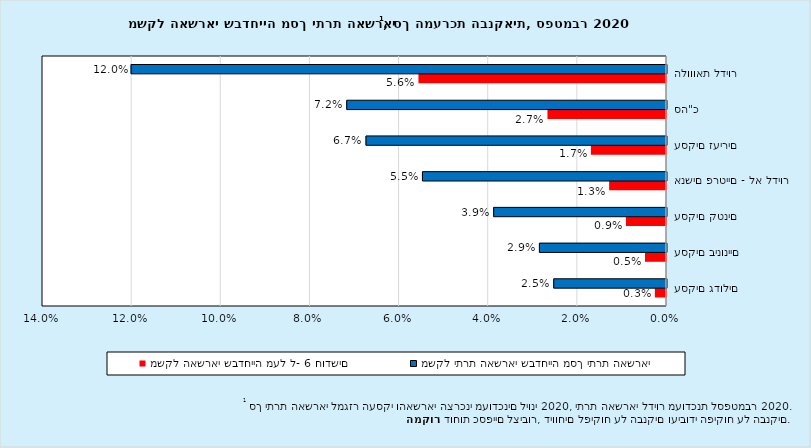
| Category | משקל האשראי שבדחייה מעל ל- 6 חודשים | משקל יתרת האשראי שבדחייה מסך יתרת האשראי |
|---|---|---|
| עסקים גדולים | 0.003 | 0.025 |
| עסקים בינוניים | 0.005 | 0.029 |
| עסקים קטנים | 0.009 | 0.039 |
| אנשים פרטיים - לא לדיור | 0.013 | 0.055 |
| עסקים זעירים | 0.017 | 0.067 |
| סה"כ | 0.027 | 0.072 |
| הלווואת לדיור | 0.056 | 0.12 |